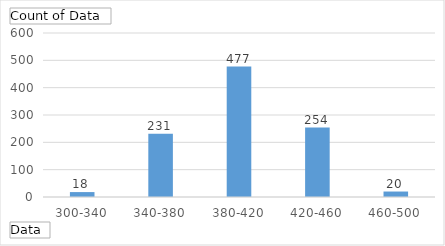
| Category | Total |
|---|---|
| 300-340 | 18 |
| 340-380 | 231 |
| 380-420 | 477 |
| 420-460 | 254 |
| 460-500 | 20 |